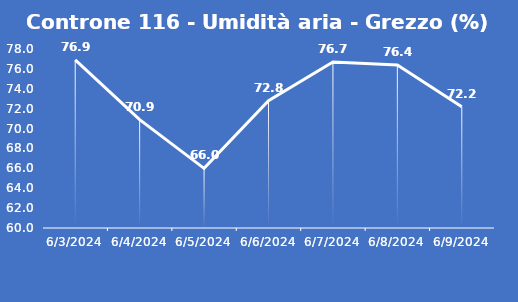
| Category | Controne 116 - Umidità aria - Grezzo (%) |
|---|---|
| 6/3/24 | 76.9 |
| 6/4/24 | 70.9 |
| 6/5/24 | 66 |
| 6/6/24 | 72.8 |
| 6/7/24 | 76.7 |
| 6/8/24 | 76.4 |
| 6/9/24 | 72.2 |